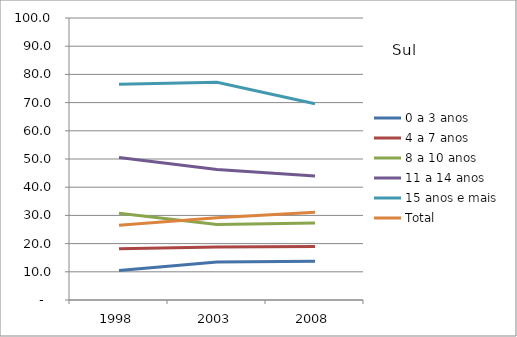
| Category | 0 a 3 anos | 4 a 7 anos | 8 a 10 anos | 11 a 14 anos | 15 anos e mais | Total |
|---|---|---|---|---|---|---|
| 1998.0 | 10.5 | 18.2 | 30.8 | 50.5 | 76.5 | 26.5 |
| 2003.0 | 13.5 | 18.8 | 26.8 | 46.3 | 77.2 | 29.2 |
| 2008.0 | 13.7 | 19 | 27.3 | 44 | 69.6 | 31.1 |